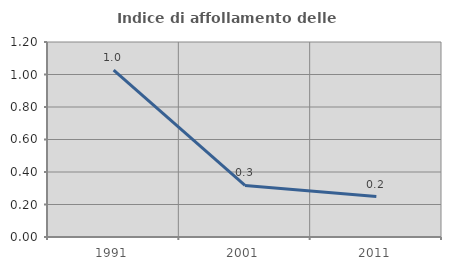
| Category | Indice di affollamento delle abitazioni  |
|---|---|
| 1991.0 | 1.026 |
| 2001.0 | 0.317 |
| 2011.0 | 0.249 |